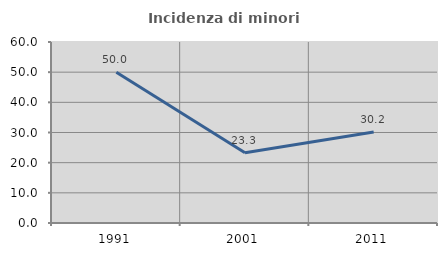
| Category | Incidenza di minori stranieri |
|---|---|
| 1991.0 | 50 |
| 2001.0 | 23.256 |
| 2011.0 | 30.159 |